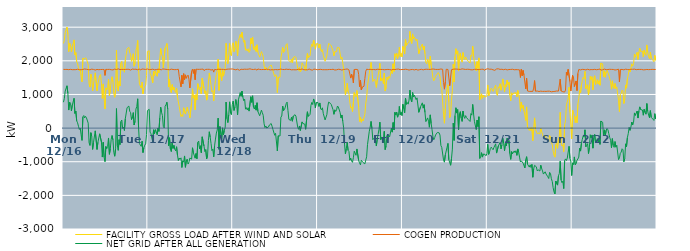
| Category | FACILITY GROSS LOAD AFTER WIND AND SOLAR | COGEN PRODUCTION | NET GRID AFTER ALL GENERATION |
|---|---|---|---|
|  Mon  12/16 | 2516 | 1746 | 770 |
|  Mon  12/16 | 2610 | 1735 | 875 |
|  Mon  12/16 | 2843 | 1743 | 1100 |
|  Mon  12/16 | 2864 | 1746 | 1118 |
|  Mon  12/16 | 3003 | 1745 | 1258 |
|  Mon  12/16 | 2792 | 1755 | 1037 |
|  Mon  12/16 | 2273 | 1737 | 536 |
|  Mon  12/16 | 2523 | 1752 | 771 |
|  Mon  12/16 | 2486 | 1747 | 739 |
|  Mon  12/16 | 2263 | 1751 | 512 |
|  Mon  12/16 | 2418 | 1736 | 682 |
|  Mon  12/16 | 2398 | 1744 | 654 |
|  Mon  12/16 | 2622 | 1737 | 885 |
|  Mon  12/16 | 2175 | 1739 | 436 |
|  Mon  12/16 | 2244 | 1738 | 506 |
|  Mon  12/16 | 1972 | 1758 | 214 |
|  Mon  12/16 | 1907 | 1750 | 157 |
|  Mon  12/16 | 1800 | 1747 | 53 |
|  Mon  12/16 | 1698 | 1739 | -41 |
|  Mon  12/16 | 1740 | 1738 | 2 |
|  Mon  12/16 | 1535 | 1734 | -199 |
|  Mon  12/16 | 1375 | 1741 | -366 |
|  Mon  12/16 | 2078 | 1745 | 333 |
|  Mon  12/16 | 2099 | 1726 | 373 |
|  Mon  12/16 | 2060 | 1757 | 303 |
|  Mon  12/16 | 2093 | 1744 | 349 |
|  Mon  12/16 | 2056 | 1749 | 307 |
|  Mon  12/16 | 2051 | 1737 | 314 |
|  Mon  12/16 | 1886 | 1739 | 147 |
|  Mon  12/16 | 1314 | 1748 | -434 |
|  Mon  12/16 | 1218 | 1733 | -515 |
|  Mon  12/16 | 1601 | 1738 | -137 |
|  Mon  12/16 | 1508 | 1753 | -245 |
|  Tue  12/17 | 1105 | 1739 | -634 |
|  Tue  12/17 | 1316 | 1743 | -427 |
|  Tue  12/17 | 1343 | 1750 | -407 |
|  Tue  12/17 | 1643 | 1725 | -82 |
|  Tue  12/17 | 1637 | 1740 | -103 |
|  Tue  12/17 | 1110 | 1744 | -634 |
|  Tue  12/17 | 1327 | 1748 | -421 |
|  Tue  12/17 | 1309 | 1736 | -427 |
|  Tue  12/17 | 1555 | 1725 | -170 |
|  Tue  12/17 | 1590 | 1741 | -151 |
|  Tue  12/17 | 1337 | 1752 | -415 |
|  Tue  12/17 | 882 | 1743 | -861 |
|  Tue  12/17 | 1313 | 1735 | -422 |
|  Tue  12/17 | 879 | 1742 | -863 |
|  Tue  12/17 | 569 | 1566 | -997 |
|  Tue  12/17 | 1197 | 1745 | -548 |
|  Tue  12/17 | 1144 | 1753 | -609 |
|  Tue  12/17 | 1199 | 1744 | -545 |
|  Tue  12/17 | 1451 | 1745 | -294 |
|  Tue  12/17 | 967 | 1746 | -779 |
|  Tue  12/17 | 1122 | 1742 | -620 |
|  Tue  12/17 | 1400 | 1735 | -335 |
|  Tue  12/17 | 1526 | 1747 | -221 |
|  Tue  12/17 | 1379 | 1729 | -350 |
|  Tue  12/17 | 1023 | 1744 | -721 |
|  Tue  12/17 | 916 | 1753 | -837 |
|  Tue  12/17 | 1138 | 1752 | -614 |
|  Tue  12/17 | 2321 | 1741 | 580 |
|  Tue  12/17 | 1205 | 1732 | -527 |
|  Tue  12/17 | 1100 | 1761 | -661 |
|  Tue  12/17 | 1388 | 1733 | -345 |
|  Tue  12/17 | 1251 | 1740 | -489 |
|  Tue  12/17 | 1929 | 1738 | 191 |
|  Tue  12/17 | 1985 | 1745 | 240 |
|  Tue  12/17 | 1713 | 1726 | -13 |
|  Tue  12/17 | 1770 | 1744 | 26 |
|  Tue  12/17 | 1662 | 1734 | -72 |
|  Tue  12/17 | 2025 | 1744 | 281 |
|  Tue  12/17 | 2027 | 1727 | 300 |
|  Tue  12/17 | 2356 | 1748 | 608 |
|  Tue  12/17 | 2346 | 1753 | 593 |
|  Tue  12/17 | 2401 | 1747 | 654 |
|  Tue  12/17 | 2239 | 1740 | 499 |
|  Tue  12/17 | 2184 | 1725 | 459 |
|  Tue  12/17 | 1987 | 1734 | 253 |
|  Tue  12/17 | 2088 | 1755 | 333 |
|  Tue  12/17 | 2211 | 1751 | 460 |
|  Tue  12/17 | 1839 | 1748 | 91 |
|  Tue  12/17 | 1936 | 1734 | 202 |
|  Tue  12/17 | 2317 | 1750 | 567 |
|  Tue  12/17 | 2383 | 1742 | 641 |
|  Tue  12/17 | 2605 | 1734 | 871 |
|  Tue  12/17 | 1748 | 1738 | 10 |
|  Tue  12/17 | 1296 | 1759 | -463 |
|  Tue  12/17 | 1252 | 1727 | -475 |
|  Tue  12/17 | 1188 | 1732 | -544 |
|  Tue  12/17 | 1368 | 1757 | -389 |
|  Tue  12/17 | 1017 | 1744 | -727 |
|  Tue  12/17 | 1167 | 1751 | -584 |
|  Tue  12/17 | 1238 | 1746 | -508 |
|  Tue  12/17 | 1275 | 1743 | -468 |
|  Tue  12/17 | 1557 | 1749 | -192 |
|  Tue  12/17 | 2277 | 1758 | 519 |
|  Tue  12/17 | 2300 | 1757 | 543 |
|  Tue  12/17 | 2297 | 1739 | 558 |
|  Tue  12/17 | 1626 | 1745 | -119 |
|  Tue  12/17 | 1576 | 1742 | -166 |
|  Tue  12/17 | 1571 | 1733 | -162 |
|  Tue  12/17 | 1346 | 1752 | -406 |
|  Tue  12/17 | 1695 | 1745 | -50 |
|  Tue  12/17 | 1567 | 1733 | -166 |
|  Tue  12/17 | 1701 | 1747 | -46 |
|  Tue  12/17 | 1637 | 1739 | -102 |
|  Tue  12/17 | 1541 | 1735 | -194 |
|  Tue  12/17 | 1752 | 1751 | 1 |
|  Tue  12/17 | 1646 | 1744 | -98 |
|  Tue  12/17 | 2052 | 1746 | 306 |
|  Tue  12/17 | 2366 | 1744 | 622 |
|  Tue  12/17 | 2196 | 1729 | 467 |
|  Tue  12/17 | 2132 | 1760 | 372 |
|  Tue  12/17 | 1787 | 1738 | 49 |
|  Tue  12/17 | 1758 | 1753 | 5 |
|  Tue  12/17 | 2381 | 1731 | 650 |
|  Tue  12/17 | 2438 | 1747 | 691 |
|  Tue  12/17 | 2514 | 1745 | 769 |
|  Tue  12/17 | 2302 | 1740 | 562 |
|  Tue  12/17 | 1220 | 1745 | -525 |
|  Tue  12/17 | 1448 | 1735 | -287 |
|  Tue  12/17 | 1121 | 1742 | -621 |
|  Tue  12/17 | 1056 | 1753 | -697 |
|  Tue  12/17 | 1292 | 1741 | -449 |
|  Tue  12/17 | 1139 | 1742 | -603 |
|  Tue  12/17 | 1221 | 1736 | -515 |
|  Tue  12/17 | 1109 | 1737 | -628 |
|  Tue  12/17 | 1060 | 1738 | -678 |
|  Tue  12/17 | 1186 | 1740 | -554 |
|  Wed  12/18 | 919 | 1721 | -802 |
|  Wed  12/18 | 786 | 1749 | -963 |
|  Wed  12/18 | 638 | 1530 | -892 |
|  Wed  12/18 | 633 | 1558 | -925 |
|  Wed  12/18 | 341 | 1226 | -885 |
|  Wed  12/18 | 399 | 1570 | -1171 |
|  Wed  12/18 | 345 | 1317 | -972 |
|  Wed  12/18 | 605 | 1619 | -1014 |
|  Wed  12/18 | 612 | 1440 | -828 |
|  Wed  12/18 | 417 | 1582 | -1165 |
|  Wed  12/18 | 503 | 1480 | -977 |
|  Wed  12/18 | 618 | 1538 | -920 |
|  Wed  12/18 | 506 | 1575 | -1069 |
|  Wed  12/18 | 437 | 1452 | -1015 |
|  Wed  12/18 | 301 | 1192 | -891 |
|  Wed  12/18 | 324 | 1192 | -868 |
|  Wed  12/18 | 763 | 1685 | -922 |
|  Wed  12/18 | 1169 | 1754 | -585 |
|  Wed  12/18 | 889 | 1626 | -737 |
|  Wed  12/18 | 985 | 1745 | -760 |
|  Wed  12/18 | 544 | 1438 | -894 |
|  Wed  12/18 | 995 | 1751 | -756 |
|  Wed  12/18 | 843 | 1753 | -910 |
|  Wed  12/18 | 1321 | 1747 | -426 |
|  Wed  12/18 | 1350 | 1736 | -386 |
|  Wed  12/18 | 1133 | 1747 | -614 |
|  Wed  12/18 | 1216 | 1742 | -526 |
|  Wed  12/18 | 1016 | 1750 | -734 |
|  Wed  12/18 | 1483 | 1742 | -259 |
|  Wed  12/18 | 1502 | 1754 | -252 |
|  Wed  12/18 | 1178 | 1711 | -533 |
|  Wed  12/18 | 1030 | 1730 | -700 |
|  Wed  12/18 | 1108 | 1746 | -638 |
|  Wed  12/18 | 831 | 1745 | -914 |
|  Wed  12/18 | 914 | 1747 | -833 |
|  Wed  12/18 | 1372 | 1734 | -362 |
|  Wed  12/18 | 1639 | 1748 | -109 |
|  Wed  12/18 | 1469 | 1737 | -268 |
|  Wed  12/18 | 1266 | 1725 | -459 |
|  Wed  12/18 | 1075 | 1745 | -670 |
|  Wed  12/18 | 1116 | 1742 | -626 |
|  Wed  12/18 | 809 | 1664 | -855 |
|  Wed  12/18 | 1226 | 1745 | -519 |
|  Wed  12/18 | 1421 | 1748 | -327 |
|  Wed  12/18 | 1587 | 1735 | -148 |
|  Wed  12/18 | 1703 | 1760 | -57 |
|  Wed  12/18 | 2048 | 1752 | 296 |
|  Wed  12/18 | 1122 | 1753 | -631 |
|  Wed  12/18 | 1791 | 1745 | 46 |
|  Wed  12/18 | 1800 | 1731 | 69 |
|  Wed  12/18 | 1413 | 1747 | -334 |
|  Wed  12/18 | 1761 | 1754 | 7 |
|  Wed  12/18 | 1545 | 1745 | -200 |
|  Wed  12/18 | 1676 | 1744 | -68 |
|  Wed  12/18 | 1762 | 1736 | 26 |
|  Wed  12/18 | 2521 | 1748 | 773 |
|  Wed  12/18 | 2026 | 1750 | 276 |
|  Wed  12/18 | 1914 | 1750 | 164 |
|  Wed  12/18 | 2151 | 1754 | 397 |
|  Wed  12/18 | 2515 | 1735 | 780 |
|  Wed  12/18 | 2207 | 1756 | 451 |
|  Wed  12/18 | 2151 | 1754 | 397 |
|  Wed  12/18 | 2454 | 1758 | 696 |
|  Wed  12/18 | 2536 | 1735 | 801 |
|  Wed  12/18 | 2273 | 1747 | 526 |
|  Wed  12/18 | 2367 | 1743 | 624 |
|  Wed  12/18 | 2581 | 1732 | 849 |
|  Wed  12/18 | 2424 | 1729 | 695 |
|  Wed  12/18 | 2146 | 1752 | 394 |
|  Wed  12/18 | 2594 | 1745 | 849 |
|  Wed  12/18 | 2571 | 1719 | 852 |
|  Wed  12/18 | 2786 | 1733 | 1053 |
|  Wed  12/18 | 2696 | 1749 | 947 |
|  Wed  12/18 | 2848 | 1748 | 1100 |
|  Wed  12/18 | 2661 | 1744 | 917 |
|  Wed  12/18 | 2550 | 1736 | 814 |
|  Wed  12/18 | 2609 | 1751 | 858 |
|  Wed  12/18 | 2316 | 1754 | 562 |
|  Wed  12/18 | 2355 | 1748 | 607 |
|  Wed  12/18 | 2288 | 1748 | 540 |
|  Wed  12/18 | 2357 | 1751 | 606 |
|  Wed  12/18 | 2250 | 1745 | 505 |
|  Wed  12/18 | 2296 | 1762 | 534 |
|  Wed  12/18 | 2675 | 1742 | 933 |
|  Wed  12/18 | 2511 | 1746 | 765 |
|  Wed  12/18 | 2701 | 1741 | 960 |
|  Wed  12/18 | 2361 | 1741 | 620 |
|  Wed  12/18 | 2321 | 1753 | 568 |
|  Wed  12/18 | 2429 | 1753 | 676 |
|  Wed  12/18 | 2279 | 1746 | 533 |
|  Wed  12/18 | 2477 | 1723 | 754 |
|  Wed  12/18 | 2250 | 1758 | 492 |
|  Wed  12/18 | 2252 | 1741 | 511 |
|  Wed  12/18 | 2109 | 1743 | 366 |
|  Wed  12/18 | 2089 | 1736 | 353 |
|  Wed  12/18 | 2274 | 1740 | 534 |
|  Thu  12/19 | 2212 | 1754 | 458 |
|  Thu  12/19 | 2121 | 1742 | 379 |
|  Thu  12/19 | 1847 | 1720 | 127 |
|  Thu  12/19 | 1755 | 1740 | 15 |
|  Thu  12/19 | 1807 | 1744 | 63 |
|  Thu  12/19 | 1755 | 1753 | 2 |
|  Thu  12/19 | 1719 | 1742 | -23 |
|  Thu  12/19 | 1774 | 1742 | 32 |
|  Thu  12/19 | 1836 | 1744 | 92 |
|  Thu  12/19 | 1850 | 1730 | 120 |
|  Thu  12/19 | 1874 | 1738 | 136 |
|  Thu  12/19 | 1791 | 1736 | 55 |
|  Thu  12/19 | 1700 | 1739 | -39 |
|  Thu  12/19 | 1676 | 1732 | -56 |
|  Thu  12/19 | 1531 | 1745 | -214 |
|  Thu  12/19 | 1585 | 1741 | -156 |
|  Thu  12/19 | 1552 | 1733 | -181 |
|  Thu  12/19 | 1057 | 1735 | -678 |
|  Thu  12/19 | 1513 | 1741 | -228 |
|  Thu  12/19 | 1509 | 1741 | -232 |
|  Thu  12/19 | 1510 | 1746 | -236 |
|  Thu  12/19 | 2081 | 1755 | 326 |
|  Thu  12/19 | 2100 | 1741 | 359 |
|  Thu  12/19 | 2398 | 1742 | 656 |
|  Thu  12/19 | 2250 | 1733 | 517 |
|  Thu  12/19 | 2287 | 1740 | 547 |
|  Thu  12/19 | 2372 | 1749 | 623 |
|  Thu  12/19 | 2480 | 1752 | 728 |
|  Thu  12/19 | 2510 | 1738 | 772 |
|  Thu  12/19 | 2266 | 1744 | 522 |
|  Thu  12/19 | 2013 | 1754 | 259 |
|  Thu  12/19 | 2020 | 1747 | 273 |
|  Thu  12/19 | 1957 | 1729 | 228 |
|  Thu  12/19 | 2054 | 1732 | 322 |
|  Thu  12/19 | 1942 | 1737 | 205 |
|  Thu  12/19 | 2095 | 1736 | 359 |
|  Thu  12/19 | 2086 | 1746 | 340 |
|  Thu  12/19 | 2130 | 1732 | 398 |
|  Thu  12/19 | 2097 | 1741 | 356 |
|  Thu  12/19 | 2109 | 1736 | 373 |
|  Thu  12/19 | 1779 | 1746 | 33 |
|  Thu  12/19 | 1715 | 1751 | -36 |
|  Thu  12/19 | 1810 | 1747 | 63 |
|  Thu  12/19 | 1671 | 1742 | -71 |
|  Thu  12/19 | 1702 | 1747 | -45 |
|  Thu  12/19 | 1941 | 1757 | 184 |
|  Thu  12/19 | 1887 | 1751 | 136 |
|  Thu  12/19 | 1852 | 1734 | 118 |
|  Thu  12/19 | 1851 | 1735 | 116 |
|  Thu  12/19 | 1700 | 1736 | -36 |
|  Thu  12/19 | 1707 | 1733 | -26 |
|  Thu  12/19 | 2217 | 1732 | 485 |
|  Thu  12/19 | 2094 | 1747 | 347 |
|  Thu  12/19 | 2093 | 1756 | 337 |
|  Thu  12/19 | 2151 | 1743 | 408 |
|  Thu  12/19 | 2405 | 1732 | 673 |
|  Thu  12/19 | 2496 | 1732 | 764 |
|  Thu  12/19 | 2423 | 1722 | 701 |
|  Thu  12/19 | 2619 | 1753 | 866 |
|  Thu  12/19 | 2518 | 1741 | 777 |
|  Thu  12/19 | 2349 | 1749 | 600 |
|  Thu  12/19 | 2506 | 1743 | 763 |
|  Thu  12/19 | 2502 | 1734 | 768 |
|  Thu  12/19 | 2510 | 1752 | 758 |
|  Thu  12/19 | 2386 | 1741 | 645 |
|  Thu  12/19 | 2496 | 1749 | 747 |
|  Thu  12/19 | 2324 | 1747 | 577 |
|  Thu  12/19 | 2273 | 1731 | 542 |
|  Thu  12/19 | 2339 | 1736 | 603 |
|  Thu  12/19 | 2166 | 1737 | 429 |
|  Thu  12/19 | 2153 | 1736 | 417 |
|  Thu  12/19 | 1987 | 1745 | 242 |
|  Thu  12/19 | 1961 | 1735 | 226 |
|  Thu  12/19 | 2144 | 1746 | 398 |
|  Thu  12/19 | 2365 | 1737 | 628 |
|  Thu  12/19 | 2515 | 1744 | 771 |
|  Thu  12/19 | 2502 | 1743 | 759 |
|  Thu  12/19 | 2480 | 1743 | 737 |
|  Thu  12/19 | 2442 | 1741 | 701 |
|  Thu  12/19 | 2438 | 1734 | 704 |
|  Thu  12/19 | 2294 | 1749 | 545 |
|  Thu  12/19 | 2147 | 1737 | 410 |
|  Thu  12/19 | 2270 | 1727 | 543 |
|  Thu  12/19 | 2243 | 1748 | 495 |
|  Thu  12/19 | 2278 | 1732 | 546 |
|  Thu  12/19 | 2400 | 1744 | 656 |
|  Thu  12/19 | 2375 | 1749 | 626 |
|  Thu  12/19 | 2385 | 1748 | 637 |
|  Thu  12/19 | 2203 | 1743 | 460 |
|  Thu  12/19 | 2051 | 1746 | 305 |
|  Thu  12/19 | 2115 | 1725 | 390 |
|  Thu  12/19 | 1939 | 1734 | 205 |
|  Thu  12/19 | 1750 | 1743 | 7 |
|  Thu  12/19 | 1277 | 1752 | -475 |
|  Thu  12/19 | 983 | 1748 | -765 |
|  Thu  12/19 | 1145 | 1751 | -606 |
|  Fri  12/20 | 1333 | 1758 | -425 |
|  Fri  12/20 | 1081 | 1742 | -661 |
|  Fri  12/20 | 1035 | 1732 | -697 |
|  Fri  12/20 | 771 | 1725 | -954 |
|  Fri  12/20 | 595 | 1487 | -892 |
|  Fri  12/20 | 626 | 1603 | -977 |
|  Fri  12/20 | 488 | 1506 | -1018 |
|  Fri  12/20 | 463 | 1344 | -881 |
|  Fri  12/20 | 1054 | 1740 | -686 |
|  Fri  12/20 | 1060 | 1750 | -690 |
|  Fri  12/20 | 938 | 1747 | -809 |
|  Fri  12/20 | 1117 | 1737 | -620 |
|  Fri  12/20 | 1132 | 1736 | -604 |
|  Fri  12/20 | 629 | 1596 | -967 |
|  Fri  12/20 | 197 | 1230 | -1033 |
|  Fri  12/20 | 330 | 1424 | -1094 |
|  Fri  12/20 | 175 | 1132 | -957 |
|  Fri  12/20 | 258 | 1218 | -960 |
|  Fri  12/20 | 214 | 1240 | -1026 |
|  Fri  12/20 | 211 | 1243 | -1032 |
|  Fri  12/20 | 411 | 1474 | -1063 |
|  Fri  12/20 | 738 | 1691 | -953 |
|  Fri  12/20 | 897 | 1750 | -853 |
|  Fri  12/20 | 1255 | 1746 | -491 |
|  Fri  12/20 | 1236 | 1741 | -505 |
|  Fri  12/20 | 1633 | 1727 | -94 |
|  Fri  12/20 | 1773 | 1747 | 26 |
|  Fri  12/20 | 1951 | 1753 | 198 |
|  Fri  12/20 | 1726 | 1737 | -11 |
|  Fri  12/20 | 1386 | 1732 | -346 |
|  Fri  12/20 | 1382 | 1743 | -361 |
|  Fri  12/20 | 1452 | 1735 | -283 |
|  Fri  12/20 | 1367 | 1734 | -367 |
|  Fri  12/20 | 1209 | 1742 | -533 |
|  Fri  12/20 | 1428 | 1750 | -322 |
|  Fri  12/20 | 1565 | 1751 | -186 |
|  Fri  12/20 | 1711 | 1746 | -35 |
|  Fri  12/20 | 1924 | 1748 | 176 |
|  Fri  12/20 | 1401 | 1744 | -343 |
|  Fri  12/20 | 1485 | 1752 | -267 |
|  Fri  12/20 | 1447 | 1742 | -295 |
|  Fri  12/20 | 1316 | 1747 | -431 |
|  Fri  12/20 | 1636 | 1734 | -98 |
|  Fri  12/20 | 1102 | 1741 | -639 |
|  Fri  12/20 | 1211 | 1739 | -528 |
|  Fri  12/20 | 1513 | 1740 | -227 |
|  Fri  12/20 | 1438 | 1745 | -307 |
|  Fri  12/20 | 1535 | 1750 | -215 |
|  Fri  12/20 | 1482 | 1740 | -258 |
|  Fri  12/20 | 1507 | 1736 | -229 |
|  Fri  12/20 | 1724 | 1728 | -4 |
|  Fri  12/20 | 1625 | 1745 | -120 |
|  Fri  12/20 | 1911 | 1745 | 166 |
|  Fri  12/20 | 1687 | 1743 | -56 |
|  Fri  12/20 | 2210 | 1741 | 469 |
|  Fri  12/20 | 2130 | 1742 | 388 |
|  Fri  12/20 | 2225 | 1750 | 475 |
|  Fri  12/20 | 2064 | 1741 | 323 |
|  Fri  12/20 | 2121 | 1755 | 366 |
|  Fri  12/20 | 2400 | 1756 | 644 |
|  Fri  12/20 | 2133 | 1736 | 397 |
|  Fri  12/20 | 2222 | 1751 | 471 |
|  Fri  12/20 | 2114 | 1742 | 372 |
|  Fri  12/20 | 2427 | 1721 | 706 |
|  Fri  12/20 | 2317 | 1741 | 576 |
|  Fri  12/20 | 2203 | 1751 | 452 |
|  Fri  12/20 | 2638 | 1750 | 888 |
|  Fri  12/20 | 2451 | 1746 | 705 |
|  Fri  12/20 | 2501 | 1742 | 759 |
|  Fri  12/20 | 2473 | 1761 | 712 |
|  Fri  12/20 | 2558 | 1725 | 833 |
|  Fri  12/20 | 2875 | 1748 | 1127 |
|  Fri  12/20 | 2596 | 1739 | 857 |
|  Fri  12/20 | 2516 | 1739 | 777 |
|  Fri  12/20 | 2800 | 1743 | 1057 |
|  Fri  12/20 | 2659 | 1736 | 923 |
|  Fri  12/20 | 2710 | 1730 | 980 |
|  Fri  12/20 | 2726 | 1758 | 968 |
|  Fri  12/20 | 2592 | 1745 | 847 |
|  Fri  12/20 | 2645 | 1746 | 899 |
|  Fri  12/20 | 2638 | 1724 | 914 |
|  Fri  12/20 | 2212 | 1743 | 469 |
|  Fri  12/20 | 2206 | 1737 | 469 |
|  Fri  12/20 | 2388 | 1754 | 634 |
|  Fri  12/20 | 2392 | 1748 | 644 |
|  Fri  12/20 | 2499 | 1748 | 751 |
|  Fri  12/20 | 2324 | 1731 | 593 |
|  Fri  12/20 | 2439 | 1743 | 696 |
|  Fri  12/20 | 2212 | 1747 | 465 |
|  Fri  12/20 | 1945 | 1753 | 192 |
|  Fri  12/20 | 1914 | 1749 | 165 |
|  Fri  12/20 | 2045 | 1742 | 303 |
|  Fri  12/20 | 1950 | 1746 | 204 |
|  Fri  12/20 | 1774 | 1748 | 26 |
|  Fri  12/20 | 2136 | 1743 | 393 |
|  Fri  12/20 | 1880 | 1746 | 134 |
|  Sat  12/21 | 1708 | 1755 | -47 |
|  Sat  12/21 | 1489 | 1742 | -253 |
|  Sat  12/21 | 1407 | 1754 | -347 |
|  Sat  12/21 | 1459 | 1742 | -283 |
|  Sat  12/21 | 1540 | 1744 | -204 |
|  Sat  12/21 | 1523 | 1736 | -213 |
|  Sat  12/21 | 1614 | 1744 | -130 |
|  Sat  12/21 | 1650 | 1759 | -109 |
|  Sat  12/21 | 1605 | 1745 | -140 |
|  Sat  12/21 | 1529 | 1738 | -209 |
|  Sat  12/21 | 1240 | 1757 | -517 |
|  Sat  12/21 | 1176 | 1751 | -575 |
|  Sat  12/21 | 1157 | 1747 | -590 |
|  Sat  12/21 | 408 | 1354 | -946 |
|  Sat  12/21 | 145 | 1157 | -1012 |
|  Sat  12/21 | 573 | 1370 | -797 |
|  Sat  12/21 | 945 | 1748 | -803 |
|  Sat  12/21 | 1175 | 1743 | -568 |
|  Sat  12/21 | 1288 | 1743 | -455 |
|  Sat  12/21 | 784 | 1727 | -943 |
|  Sat  12/21 | 312 | 1261 | -949 |
|  Sat  12/21 | 402 | 1507 | -1105 |
|  Sat  12/21 | 831 | 1735 | -904 |
|  Sat  12/21 | 1120 | 1745 | -625 |
|  Sat  12/21 | 1897 | 1750 | 147 |
|  Sat  12/21 | 1372 | 1739 | -367 |
|  Sat  12/21 | 2128 | 1755 | 373 |
|  Sat  12/21 | 2361 | 1756 | 605 |
|  Sat  12/21 | 2199 | 1753 | 446 |
|  Sat  12/21 | 2296 | 1746 | 550 |
|  Sat  12/21 | 1696 | 1749 | -53 |
|  Sat  12/21 | 2151 | 1732 | 419 |
|  Sat  12/21 | 2233 | 1744 | 489 |
|  Sat  12/21 | 2043 | 1745 | 298 |
|  Sat  12/21 | 1960 | 1761 | 199 |
|  Sat  12/21 | 2244 | 1739 | 505 |
|  Sat  12/21 | 2097 | 1752 | 345 |
|  Sat  12/21 | 2033 | 1745 | 288 |
|  Sat  12/21 | 2114 | 1744 | 370 |
|  Sat  12/21 | 2053 | 1740 | 313 |
|  Sat  12/21 | 2070 | 1749 | 321 |
|  Sat  12/21 | 1983 | 1733 | 250 |
|  Sat  12/21 | 1983 | 1747 | 236 |
|  Sat  12/21 | 1935 | 1738 | 197 |
|  Sat  12/21 | 2164 | 1733 | 431 |
|  Sat  12/21 | 2133 | 1748 | 385 |
|  Sat  12/21 | 2436 | 1733 | 703 |
|  Sat  12/21 | 2136 | 1718 | 418 |
|  Sat  12/21 | 1935 | 1746 | 189 |
|  Sat  12/21 | 1952 | 1741 | 211 |
|  Sat  12/21 | 1705 | 1748 | -43 |
|  Sat  12/21 | 1977 | 1738 | 239 |
|  Sat  12/21 | 1778 | 1736 | 42 |
|  Sat  12/21 | 2087 | 1750 | 337 |
|  Sat  12/21 | 841 | 1744 | -903 |
|  Sat  12/21 | 863 | 1731 | -868 |
|  Sat  12/21 | 1018 | 1749 | -731 |
|  Sat  12/21 | 883 | 1745 | -862 |
|  Sat  12/21 | 980 | 1752 | -772 |
|  Sat  12/21 | 937 | 1719 | -782 |
|  Sat  12/21 | 965 | 1747 | -782 |
|  Sat  12/21 | 925 | 1749 | -824 |
|  Sat  12/21 | 973 | 1737 | -764 |
|  Sat  12/21 | 1282 | 1764 | -482 |
|  Sat  12/21 | 958 | 1739 | -781 |
|  Sat  12/21 | 1035 | 1750 | -715 |
|  Sat  12/21 | 1138 | 1742 | -604 |
|  Sat  12/21 | 1185 | 1752 | -567 |
|  Sat  12/21 | 1152 | 1761 | -609 |
|  Sat  12/21 | 1090 | 1733 | -643 |
|  Sat  12/21 | 1164 | 1741 | -577 |
|  Sat  12/21 | 1169 | 1717 | -548 |
|  Sat  12/21 | 1276 | 1743 | -467 |
|  Sat  12/21 | 1015 | 1758 | -743 |
|  Sat  12/21 | 971 | 1732 | -761 |
|  Sat  12/21 | 1229 | 1762 | -533 |
|  Sat  12/21 | 1184 | 1733 | -549 |
|  Sat  12/21 | 1318 | 1745 | -427 |
|  Sat  12/21 | 1126 | 1745 | -619 |
|  Sat  12/21 | 1245 | 1749 | -504 |
|  Sat  12/21 | 1462 | 1762 | -300 |
|  Sat  12/21 | 1286 | 1736 | -450 |
|  Sat  12/21 | 1072 | 1746 | -674 |
|  Sat  12/21 | 1290 | 1749 | -459 |
|  Sat  12/21 | 1226 | 1757 | -531 |
|  Sat  12/21 | 1428 | 1730 | -302 |
|  Sat  12/21 | 1293 | 1744 | -451 |
|  Sat  12/21 | 1369 | 1741 | -372 |
|  Sat  12/21 | 978 | 1738 | -760 |
|  Sat  12/21 | 813 | 1743 | -930 |
|  Sat  12/21 | 1048 | 1748 | -700 |
|  Sat  12/21 | 985 | 1749 | -764 |
|  Sat  12/21 | 964 | 1746 | -782 |
|  Sat  12/21 | 1055 | 1734 | -679 |
|  Sat  12/21 | 1021 | 1751 | -730 |
|  Sat  12/21 | 1066 | 1738 | -672 |
|  Sun  12/22 | 930 | 1741 | -811 |
|  Sun  12/22 | 1117 | 1736 | -619 |
|  Sun  12/22 | 1017 | 1738 | -721 |
|  Sun  12/22 | 867 | 1730 | -863 |
|  Sun  12/22 | 499 | 1505 | -1006 |
|  Sun  12/22 | 774 | 1749 | -975 |
|  Sun  12/22 | 590 | 1557 | -967 |
|  Sun  12/22 | 674 | 1715 | -1041 |
|  Sun  12/22 | 512 | 1569 | -1057 |
|  Sun  12/22 | 383 | 1567 | -1184 |
|  Sun  12/22 | 228 | 1165 | -937 |
|  Sun  12/22 | 629 | 1479 | -850 |
|  Sun  12/22 | 30 | 1103 | -1073 |
|  Sun  12/22 | 43 | 1094 | -1051 |
|  Sun  12/22 | -69 | 1091 | -1160 |
|  Sun  12/22 | 15 | 1108 | -1093 |
|  Sun  12/22 | -81 | 1092 | -1173 |
|  Sun  12/22 | 18 | 1097 | -1079 |
|  Sun  12/22 | -371 | 1090 | -1461 |
|  Sun  12/22 | -18 | 1189 | -1207 |
|  Sun  12/22 | 304 | 1412 | -1108 |
|  Sun  12/22 | -39 | 1098 | -1137 |
|  Sun  12/22 | -57 | 1095 | -1152 |
|  Sun  12/22 | -169 | 1102 | -1271 |
|  Sun  12/22 | -146 | 1095 | -1241 |
|  Sun  12/22 | -143 | 1087 | -1230 |
|  Sun  12/22 | -182 | 1094 | -1276 |
|  Sun  12/22 | -5 | 1099 | -1104 |
|  Sun  12/22 | -108 | 1095 | -1203 |
|  Sun  12/22 | -183 | 1091 | -1274 |
|  Sun  12/22 | -271 | 1096 | -1367 |
|  Sun  12/22 | -275 | 1093 | -1368 |
|  Sun  12/22 | -218 | 1081 | -1299 |
|  Sun  12/22 | -275 | 1091 | -1366 |
|  Sun  12/22 | -264 | 1104 | -1368 |
|  Sun  12/22 | -350 | 1098 | -1448 |
|  Sun  12/22 | -399 | 1100 | -1499 |
|  Sun  12/22 | -219 | 1097 | -1316 |
|  Sun  12/22 | -253 | 1096 | -1349 |
|  Sun  12/22 | -427 | 1079 | -1506 |
|  Sun  12/22 | -493 | 1094 | -1587 |
|  Sun  12/22 | -684 | 1086 | -1770 |
|  Sun  12/22 | -808 | 1089 | -1897 |
|  Sun  12/22 | -864 | 1092 | -1956 |
|  Sun  12/22 | -495 | 1079 | -1574 |
|  Sun  12/22 | -448 | 1103 | -1551 |
|  Sun  12/22 | -601 | 1094 | -1695 |
|  Sun  12/22 | -323 | 1099 | -1422 |
|  Sun  12/22 | -262 | 1087 | -1349 |
|  Sun  12/22 | 468 | 1453 | -985 |
|  Sun  12/22 | -442 | 1104 | -1546 |
|  Sun  12/22 | -532 | 1091 | -1623 |
|  Sun  12/22 | -499 | 1080 | -1579 |
|  Sun  12/22 | -702 | 1096 | -1798 |
|  Sun  12/22 | 104 | 1072 | -968 |
|  Sun  12/22 | 214 | 1130 | -916 |
|  Sun  12/22 | 693 | 1657 | -964 |
|  Sun  12/22 | 681 | 1573 | -892 |
|  Sun  12/22 | 873 | 1745 | -872 |
|  Sun  12/22 | 1216 | 1759 | -543 |
|  Sun  12/22 | 480 | 1381 | -901 |
|  Sun  12/22 | 122 | 1102 | -980 |
|  Sun  12/22 | -318 | 1091 | -1409 |
|  Sun  12/22 | 535 | 1570 | -1035 |
|  Sun  12/22 | 432 | 1517 | -1085 |
|  Sun  12/22 | 377 | 1234 | -857 |
|  Sun  12/22 | 164 | 1255 | -1091 |
|  Sun  12/22 | 341 | 1401 | -1060 |
|  Sun  12/22 | 162 | 1117 | -955 |
|  Sun  12/22 | 708 | 1625 | -917 |
|  Sun  12/22 | 879 | 1742 | -863 |
|  Sun  12/22 | 1127 | 1725 | -598 |
|  Sun  12/22 | 1046 | 1730 | -684 |
|  Sun  12/22 | 1286 | 1738 | -452 |
|  Sun  12/22 | 1412 | 1746 | -334 |
|  Sun  12/22 | 1507 | 1741 | -234 |
|  Sun  12/22 | 1473 | 1741 | -268 |
|  Sun  12/22 | 1686 | 1736 | -50 |
|  Sun  12/22 | 1173 | 1730 | -557 |
|  Sun  12/22 | 1230 | 1747 | -517 |
|  Sun  12/22 | 1287 | 1749 | -462 |
|  Sun  12/22 | 983 | 1740 | -757 |
|  Sun  12/22 | 1160 | 1733 | -573 |
|  Sun  12/22 | 1539 | 1737 | -198 |
|  Sun  12/22 | 1443 | 1740 | -297 |
|  Sun  12/22 | 1530 | 1734 | -204 |
|  Sun  12/22 | 1140 | 1737 | -597 |
|  Sun  12/22 | 1454 | 1737 | -283 |
|  Sun  12/22 | 1557 | 1746 | -189 |
|  Sun  12/22 | 1292 | 1734 | -442 |
|  Sun  12/22 | 1350 | 1735 | -385 |
|  Sun  12/22 | 1439 | 1752 | -313 |
|  Sun  12/22 | 1308 | 1743 | -435 |
|  Sun  12/22 | 1407 | 1743 | -336 |
|  Sun  12/22 | 1274 | 1757 | -483 |
|  Sun  12/15 | 1932 | 1722 | 210 |
|  Sun  12/15 | 1933 | 1748 | 185 |
|  Sun  12/15 | 1908 | 1734 | 174 |
|  Sun  12/15 | 1520 | 1748 | -228 |
|  Sun  12/15 | 1701 | 1754 | -53 |
|  Sun  12/15 | 1511 | 1739 | -228 |
|  Sun  12/15 | 1677 | 1737 | -60 |
|  Sun  12/15 | 1717 | 1731 | -14 |
|  Sun  12/15 | 1689 | 1741 | -52 |
|  Sun  12/15 | 1575 | 1742 | -167 |
|  Sun  12/15 | 1470 | 1748 | -278 |
|  Sun  12/15 | 1378 | 1738 | -360 |
|  Sun  12/15 | 1158 | 1745 | -587 |
|  Sun  12/15 | 1406 | 1719 | -313 |
|  Sun  12/15 | 1235 | 1743 | -508 |
|  Sun  12/15 | 1171 | 1743 | -572 |
|  Sun  12/15 | 1327 | 1727 | -400 |
|  Sun  12/15 | 1175 | 1743 | -568 |
|  Sun  12/15 | 1227 | 1736 | -509 |
|  Sun  12/15 | 1255 | 1737 | -482 |
|  Sun  12/15 | 814 | 1752 | -938 |
|  Sun  12/15 | 492 | 1379 | -887 |
|  Sun  12/15 | 995 | 1742 | -747 |
|  Sun  12/15 | 1026 | 1741 | -715 |
|  Sun  12/15 | 1129 | 1744 | -615 |
|  Sun  12/15 | 1098 | 1743 | -645 |
|  Sun  12/15 | 731 | 1732 | -1001 |
|  Sun  12/15 | 853 | 1761 | -908 |
|  Sun  12/15 | 1283 | 1751 | -468 |
|  Sun  12/15 | 1189 | 1741 | -552 |
|  Sun  12/15 | 1459 | 1742 | -283 |
|  Sun  12/15 | 1581 | 1742 | -161 |
|  Sun  12/15 | 1753 | 1735 | 18 |
|  Sun  12/15 | 1668 | 1735 | -67 |
|  Sun  12/15 | 1784 | 1750 | 34 |
|  Sun  12/15 | 1912 | 1731 | 181 |
|  Sun  12/15 | 1839 | 1748 | 91 |
|  Sun  12/15 | 1914 | 1739 | 175 |
|  Sun  12/15 | 2204 | 1753 | 451 |
|  Sun  12/15 | 2110 | 1732 | 378 |
|  Sun  12/15 | 2090 | 1737 | 353 |
|  Sun  12/15 | 2250 | 1742 | 508 |
|  Sun  12/15 | 2044 | 1745 | 299 |
|  Sun  12/15 | 2256 | 1749 | 507 |
|  Sun  12/15 | 2375 | 1744 | 631 |
|  Sun  12/15 | 2280 | 1731 | 549 |
|  Sun  12/15 | 2283 | 1744 | 539 |
|  Sun  12/15 | 2287 | 1750 | 537 |
|  Sun  12/15 | 2115 | 1732 | 383 |
|  Sun  12/15 | 2310 | 1753 | 557 |
|  Sun  12/15 | 2203 | 1734 | 469 |
|  Sun  12/15 | 2163 | 1750 | 413 |
|  Sun  12/15 | 2473 | 1744 | 729 |
|  Sun  12/15 | 2248 | 1752 | 496 |
|  Sun  12/15 | 2124 | 1738 | 386 |
|  Sun  12/15 | 2064 | 1757 | 307 |
|  Sun  12/15 | 2261 | 1741 | 520 |
|  Sun  12/15 | 2066 | 1749 | 317 |
|  Sun  12/15 | 2037 | 1746 | 291 |
|  Sun  12/15 | 2019 | 1757 | 262 |
|  Sun  12/15 | 1971 | 1743 | 228 |
|  Sun  12/15 | 2163 | 1734 | 429 |
|  Sun  12/15 | 2012 | 1743 | 269 |
|  Sun  12/15 | 2025 | 1734 | 291 |